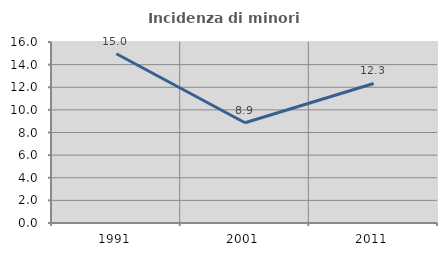
| Category | Incidenza di minori stranieri |
|---|---|
| 1991.0 | 14.966 |
| 2001.0 | 8.861 |
| 2011.0 | 12.335 |